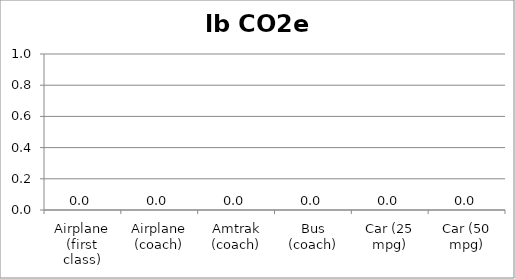
| Category | lb CO2e |
|---|---|
| Airplane (first class) | 0 |
| Airplane (coach) | 0 |
| Amtrak (coach) | 0 |
| Bus (coach) | 0 |
| Car (25 mpg) | 0 |
| Car (50 mpg) | 0 |